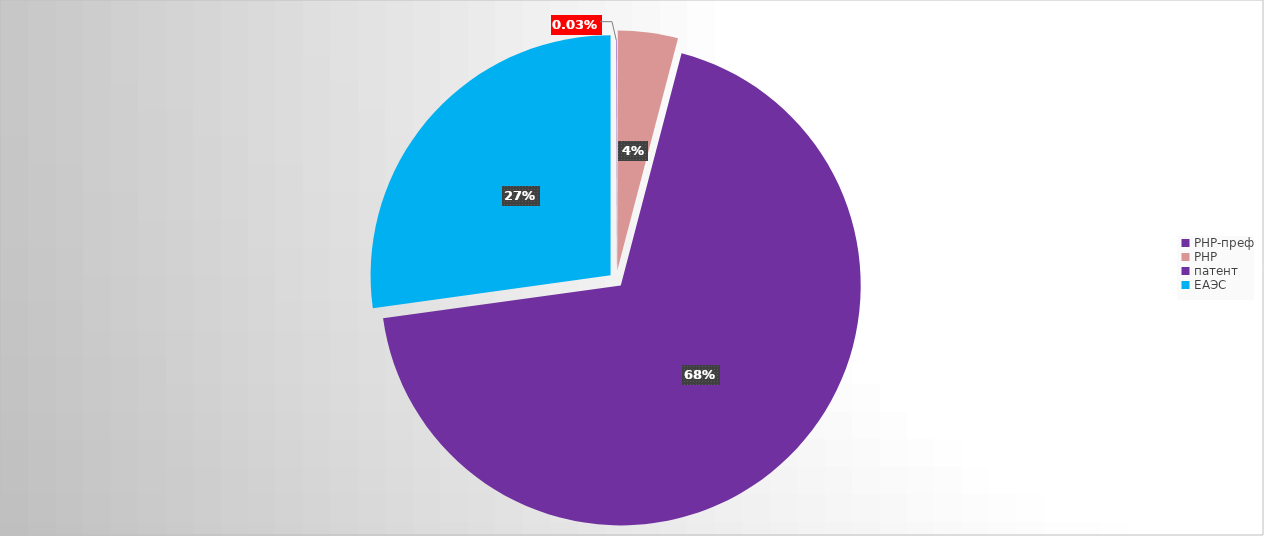
| Category | Series 0 |
|---|---|
| РНР-преф | 1156 |
| РНР | 136652 |
| патент | 2324388 |
| ЕАЭС | 919507 |